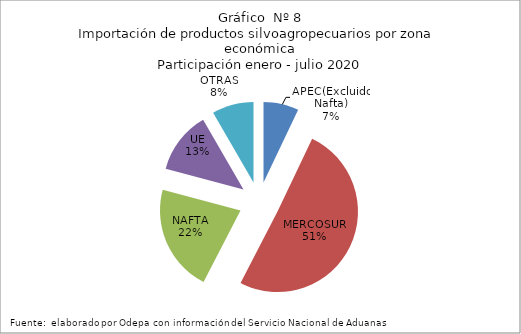
| Category | Series 0 |
|---|---|
| APEC(Excluido Nafta) | 412059.92 |
| MERCOSUR | 2937972.91 |
| NAFTA | 1253192.328 |
| UE | 727301.547 |
| OTRAS | 486485.295 |